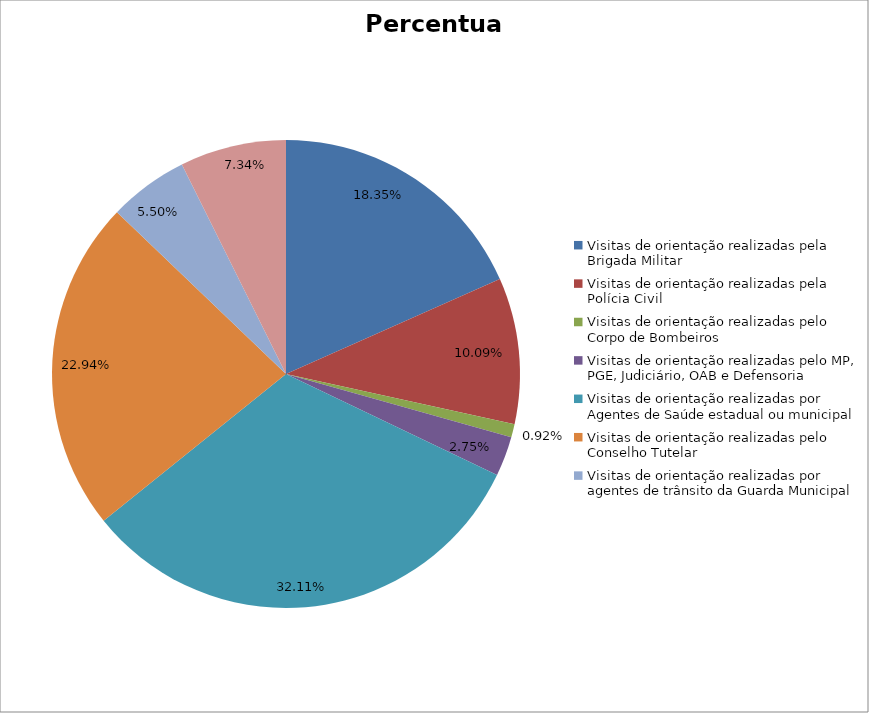
| Category | Percentual |
|---|---|
| Visitas de orientação realizadas pela Brigada Militar | 0.183 |
| Visitas de orientação realizadas pela Polícia Civil | 0.101 |
| Visitas de orientação realizadas pelo Corpo de Bombeiros | 0.009 |
| Visitas de orientação realizadas pelo MP, PGE, Judiciário, OAB e Defensoria | 0.028 |
| Visitas de orientação realizadas por Agentes de Saúde estadual ou municipal | 0.321 |
| Visitas de orientação realizadas pelo Conselho Tutelar | 0.229 |
| Visitas de orientação realizadas por agentes de trânsito da Guarda Municipal | 0.055 |
| Visitas de orientação realizadas por ONGs, entidades privadas, CRAS e CREAS | 0.073 |